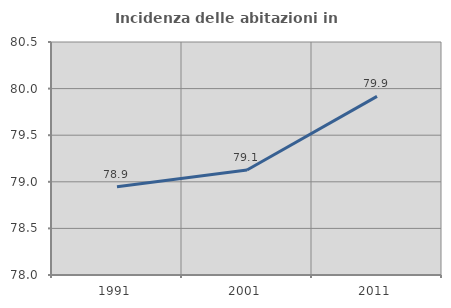
| Category | Incidenza delle abitazioni in proprietà  |
|---|---|
| 1991.0 | 78.947 |
| 2001.0 | 79.127 |
| 2011.0 | 79.917 |